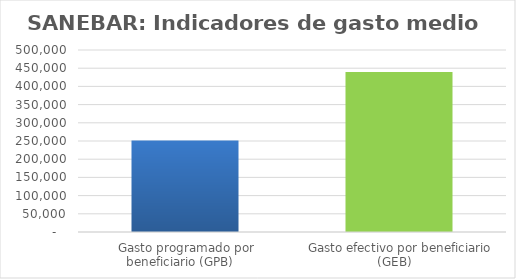
| Category | Series 0 |
|---|---|
| Gasto programado por beneficiario (GPB)  | 251676.656 |
| Gasto efectivo por beneficiario (GEB)  | 439407.518 |